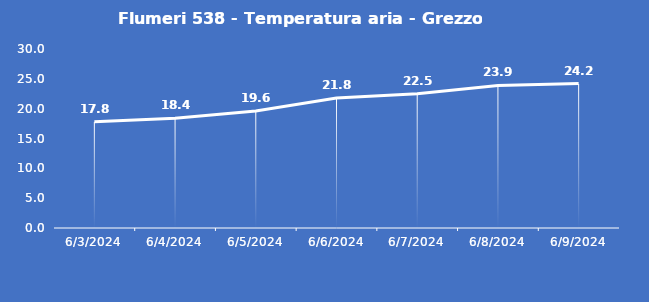
| Category | Flumeri 538 - Temperatura aria - Grezzo (°C) |
|---|---|
| 6/3/24 | 17.8 |
| 6/4/24 | 18.4 |
| 6/5/24 | 19.6 |
| 6/6/24 | 21.8 |
| 6/7/24 | 22.5 |
| 6/8/24 | 23.9 |
| 6/9/24 | 24.2 |